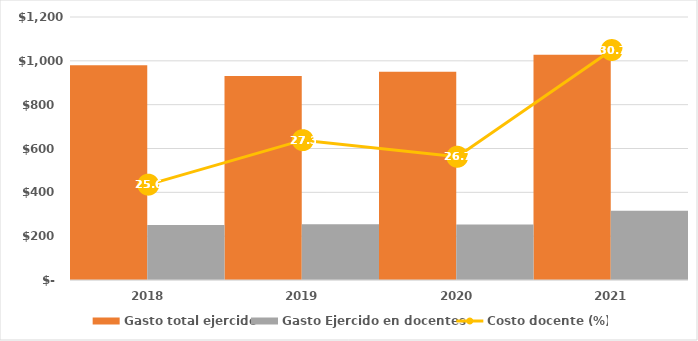
| Category | Gasto total ejercido | Gasto Ejercido en docentes |
|---|---|---|
| 2018 | 979910 | 251110 |
| 2019 | 930744.078 | 254254.971 |
| 2020 | 949931.095 | 253504.286 |
| 2021 | 1027496.009 | 315894.077 |